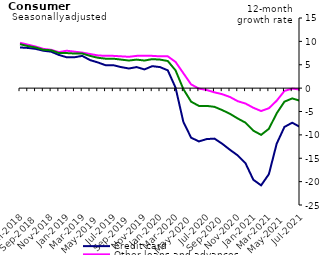
| Category | Credit card | Other loans and advances | Total |
|---|---|---|---|
| Mar-2018 | 8.8 | 10 | 9.6 |
| Apr-2018 | 8.8 | 10.4 | 9.8 |
| May-2018 | 9.2 | 10 | 9.7 |
| Jun-2018 | 9.4 | 10 | 9.8 |
| Jul-2018 | 8.9 | 9.7 | 9.4 |
| Aug-2018 | 8.8 | 9.3 | 9.1 |
| Sep-2018 | 8.5 | 8.9 | 8.8 |
| Oct-2018 | 8.1 | 8.4 | 8.3 |
| Nov-2018 | 7.9 | 8.2 | 8.1 |
| Dec-2018 | 7.1 | 7.8 | 7.5 |
| Jan-2019 | 6.5 | 8 | 7.5 |
| Feb-2019 | 6.4 | 7.8 | 7.4 |
| Mar-2019 | 6.5 | 7.5 | 7.2 |
| Apr-2019 | 5.8 | 7.3 | 6.8 |
| May-2019 | 5.5 | 6.9 | 6.5 |
| Jun-2019 | 5.1 | 6.9 | 6.3 |
| Jul-2019 | 5.3 | 7 | 6.4 |
| Aug-2019 | 4.7 | 6.9 | 6.2 |
| Sep-2019 | 4.3 | 6.8 | 6 |
| Oct-2019 | 4.7 | 6.9 | 6.2 |
| Nov-2019 | 4 | 6.9 | 5.9 |
| Dec-2019 | 4.7 | 6.9 | 6.2 |
| Jan-2020 | 4.4 | 6.8 | 6 |
| Feb-2020 | 3.5 | 6.8 | 5.7 |
| Mar-2020 | -0.4 | 5.6 | 3.6 |
| Apr-2020 | -7.5 | 3.2 | -0.3 |
| May-2020 | -10.5 | 0.7 | -2.9 |
| Jun-2020 | -11.4 | -0.1 | -3.8 |
| Jul-2020 | -10.5 | -0.4 | -3.6 |
| Aug-2020 | -10.5 | -0.8 | -4 |
| Sep-2020 | -11.7 | -1.3 | -4.7 |
| Oct-2020 | -13.1 | -1.8 | -5.5 |
| Nov-2020 | -14.4 | -2.8 | -6.5 |
| Dec-2020 | -16.2 | -3.3 | -7.4 |
| Jan-2021 | -19.7 | -4.1 | -9.1 |
| Feb-2021 | -21 | -4.9 | -10 |
| Mar-2021 | -18.5 | -4.1 | -8.6 |